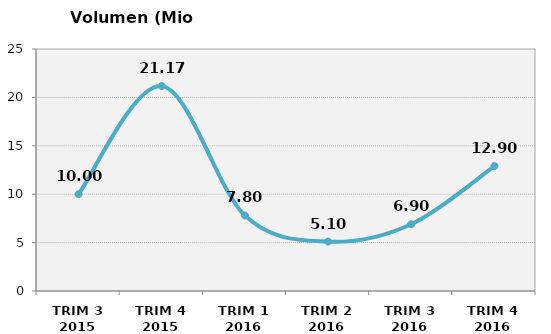
| Category | Volumen (Mio consumiciones) |
|---|---|
| TRIM 3 2015 | 10.001 |
| TRIM 4 2015 | 21.17 |
| TRIM 1 2016 | 7.8 |
| TRIM 2 2016 | 5.1 |
| TRIM 3 2016 | 6.9 |
| TRIM 4 2016 | 12.9 |